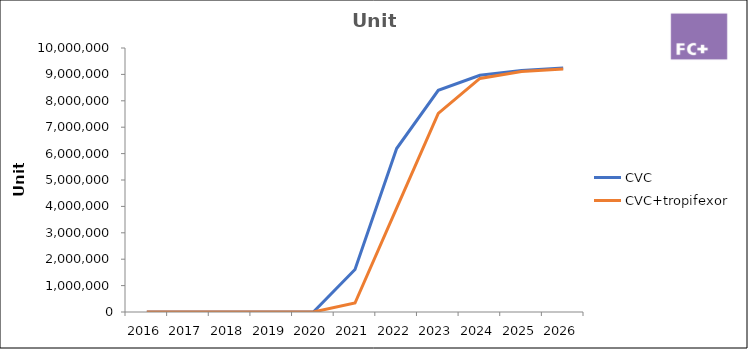
| Category | CVC | CVC+tropifexor |
|---|---|---|
| 2016.0 | 0 | 0 |
| 2017.0 | 0 | 0 |
| 2018.0 | 0 | 0 |
| 2019.0 | 0 | 0 |
| 2020.0 | 0 | 0 |
| 2021.0 | 1612292.655 | 341229.216 |
| 2022.0 | 6191270.964 | 3932916.919 |
| 2023.0 | 8397946.46 | 7524672.316 |
| 2024.0 | 8967929.475 | 8847132.851 |
| 2025.0 | 9149111.543 | 9110537.885 |
| 2026.0 | 9240602.658 | 9201643.263 |